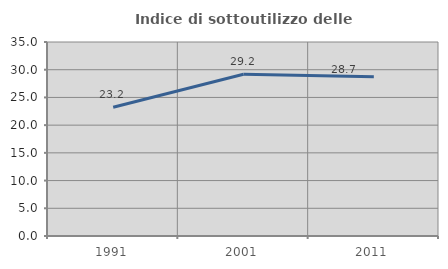
| Category | Indice di sottoutilizzo delle abitazioni  |
|---|---|
| 1991.0 | 23.232 |
| 2001.0 | 29.185 |
| 2011.0 | 28.74 |